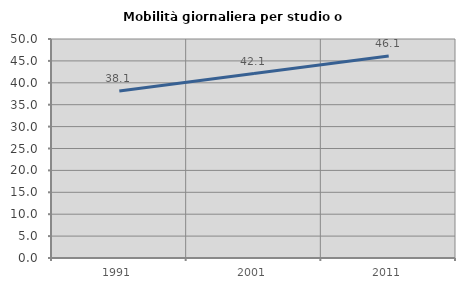
| Category | Mobilità giornaliera per studio o lavoro |
|---|---|
| 1991.0 | 38.122 |
| 2001.0 | 42.105 |
| 2011.0 | 46.101 |